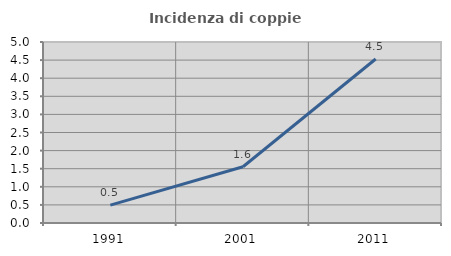
| Category | Incidenza di coppie miste |
|---|---|
| 1991.0 | 0.494 |
| 2001.0 | 1.553 |
| 2011.0 | 4.531 |